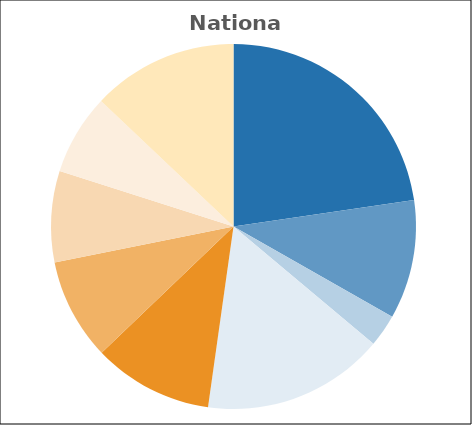
| Category | Series 0 |
|---|---|
| Basic Assistance | 0.227 |
| Work Activities | 0.105 |
| Work Supports and Supportive Services | 0.029 |
| Child Care | 0.161 |
| Administration & Systems | 0.106 |
| Tax Credit | 0.09 |
| Pre-K | 0.081 |
| Child Welfare | 0.072 |
| Other | 0.129 |